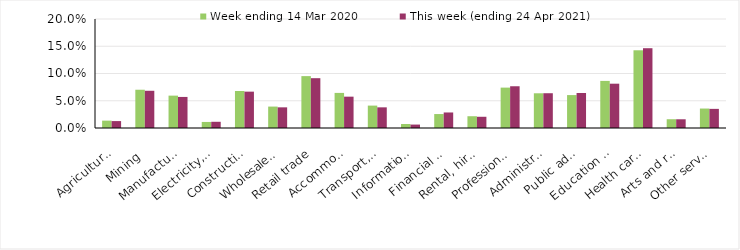
| Category | Week ending 14 Mar 2020 | This week (ending 24 Apr 2021) |
|---|---|---|
| Agriculture, forestry and fishing | 0.014 | 0.013 |
| Mining | 0.07 | 0.068 |
| Manufacturing | 0.059 | 0.057 |
| Electricity, gas, water and waste services | 0.011 | 0.011 |
| Construction | 0.068 | 0.067 |
| Wholesale trade | 0.039 | 0.038 |
| Retail trade | 0.095 | 0.091 |
| Accommodation and food services | 0.064 | 0.058 |
| Transport, postal and warehousing | 0.041 | 0.038 |
| Information media and telecommunications | 0.007 | 0.006 |
| Financial and insurance services | 0.026 | 0.028 |
| Rental, hiring and real estate services | 0.022 | 0.021 |
| Professional, scientific and technical services | 0.074 | 0.077 |
| Administrative and support services | 0.064 | 0.064 |
| Public administration and safety | 0.06 | 0.064 |
| Education and training | 0.086 | 0.081 |
| Health care and social assistance | 0.143 | 0.146 |
| Arts and recreation services | 0.016 | 0.016 |
| Other services | 0.036 | 0.035 |